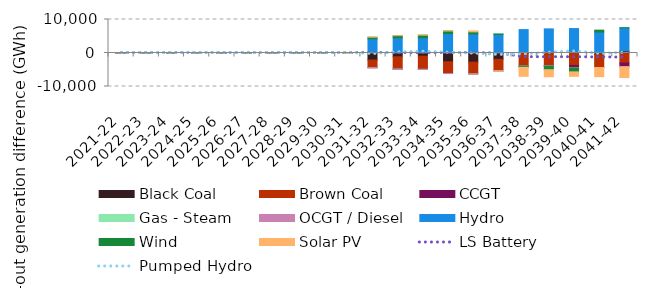
| Category | Black Coal | Brown Coal | CCGT | Gas - Steam | OCGT / Diesel | Hydro | Wind | Solar PV |
|---|---|---|---|---|---|---|---|---|
| 2021-22 | 0.019 | -0.115 | 0 | 0 | 0 | -1.862 | 0 | 0 |
| 2022-23 | 0.003 | -14.333 | 0 | 0 | 0 | 9.973 | 0 | 0 |
| 2023-24 | 0.002 | 2.794 | 0 | 0 | 0 | -6.443 | 0 | 0 |
| 2024-25 | 0.8 | 9.103 | 0 | 0 | 0 | -12.031 | 0 | 0 |
| 2025-26 | 0.053 | 0.018 | 0 | 0 | 0 | -0.16 | 0 | 0 |
| 2026-27 | 0.058 | 0.007 | 0 | 0 | 0 | -0.201 | 0 | 0 |
| 2027-28 | 0.208 | 0 | 0 | 0 | 0 | -1.086 | 0 | 0 |
| 2028-29 | 0.01 | 0 | 0 | 0 | 0 | -0.026 | 0 | 0 |
| 2029-30 | -1.784 | 0 | 0 | 0 | 0 | -1.096 | 0 | 0 |
| 2030-31 | -144.59 | -1.388 | 0 | 0 | 0 | 18.553 | -0.036 | 0 |
| 2031-32 | -2095.576 | -2282.975 | 0 | -2.085 | -3.162 | 4237.098 | 476.149 | 0.309 |
| 2032-33 | -1138.649 | -3660.376 | -0.011 | -2.21 | -6.396 | 4541.785 | 636.078 | 1.372 |
| 2033-34 | -960.558 | -3919.362 | -0.032 | -0.992 | -1.212 | 4566.9 | 761.502 | 1.044 |
| 2034-35 | -2616.856 | -3493.333 | 0.157 | -3.809 | -5.891 | 5807.444 | 752.907 | 3.242 |
| 2035-36 | -2721.802 | -3532.061 | 1.261 | -13.147 | -25.016 | 5682.745 | 627.862 | 287.964 |
| 2036-37 | -1889.381 | -3444.976 | 3.436 | -9.4 | -27.511 | 5548.922 | 129.796 | -18.587 |
| 2037-38 | 143.41 | -3895.367 | 23.871 | -3.188 | -9.769 | 6822.644 | -370.862 | -2685.547 |
| 2038-39 | 407.472 | -3795.084 | -64.067 | -7.989 | -67.388 | 6796.827 | -1045.932 | -2117.842 |
| 2039-40 | 371.839 | -3711.518 | -615.081 | 0 | -144.465 | 6925.033 | -1159.706 | -1337.149 |
| 2040-41 | -487.361 | -3835.172 | -1.277 | 0 | -7.518 | 6259.558 | 569.792 | -2733.533 |
| 2041-42 | 618.794 | -2986.444 | -1040.992 | 0 | -133.431 | 6891.308 | 19.008 | -3178.365 |